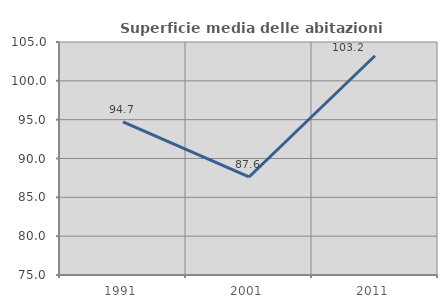
| Category | Superficie media delle abitazioni occupate |
|---|---|
| 1991.0 | 94.707 |
| 2001.0 | 87.622 |
| 2011.0 | 103.233 |